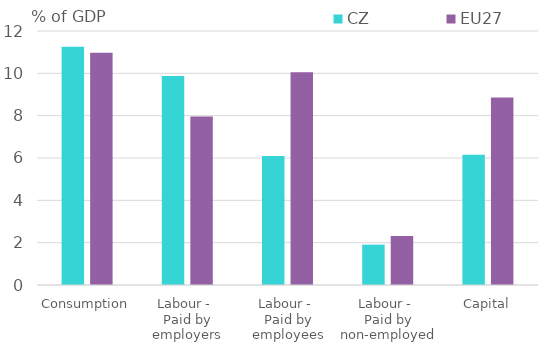
| Category | CZ | EU27 |
|---|---|---|
| Consumption | 11.258 | 10.967 |
| Labour - 
Paid by employers | 9.869 | 7.966 |
| Labour - 
Paid by employees | 6.096 | 10.052 |
| Labour - 
Paid by non-employed | 1.907 | 2.311 |
| Capital | 6.157 | 8.858 |